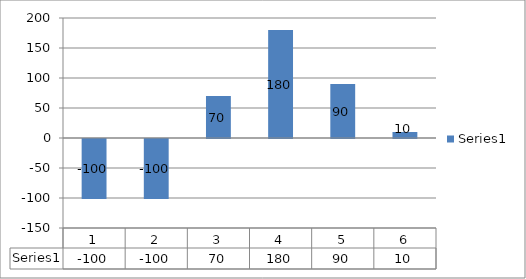
| Category | Series 0 |
|---|---|
| 0 | -100 |
| 1 | -100 |
| 2 | 70 |
| 3 | 180 |
| 4 | 90 |
| 5 | 10 |